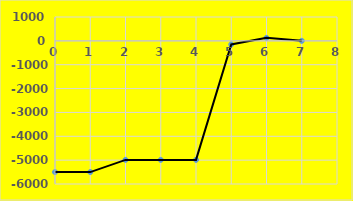
| Category | Series 0 |
|---|---|
| 0.0 | -5500 |
| 1.0 | -5500 |
| 2.0 | -4989.091 |
| 3.0 | -4989.091 |
| 4.0 | -4989.091 |
| 5.0 | -150.568 |
| 6.0 | 125 |
| 7.0 | 0 |